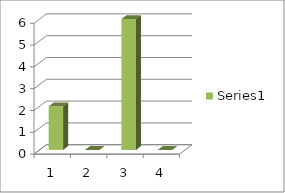
| Category | Series 0 |
|---|---|
| 0 | 2 |
| 1 | 0 |
| 2 | 6 |
| 3 | 0 |